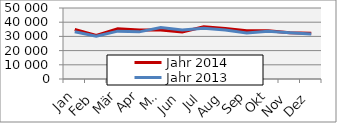
| Category | Jahr 2014 | Jahr 2013 |
|---|---|---|
| 0 | 34840.212 | 33296.24 |
| 1 | 30706.12 | 30130.604 |
| 2 | 35350.44 | 33705.068 |
| 3 | 34530.627 | 33205.993 |
| 4 | 34588.093 | 36231.541 |
| 5 | 33117.892 | 34558.775 |
| 6 | 36794.723 | 35655.937 |
| 7 | 35556.585 | 34450.958 |
| 8 | 33967.265 | 32477.521 |
| 9 | 34054.905 | 33653.032 |
| 10 | 32604.411 | 32639.392 |
| 11 | 32133.379 | 31624.021 |